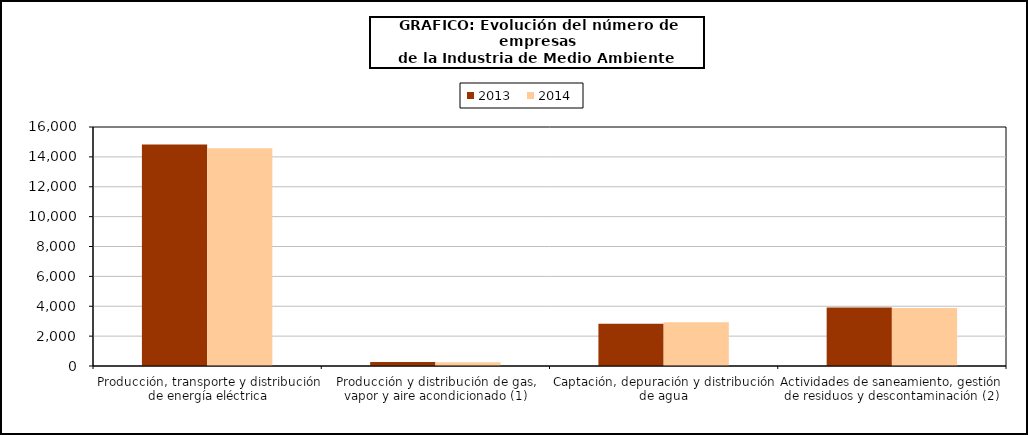
| Category | 2013 | 2014 |
|---|---|---|
| Producción, transporte y distribución de energía eléctrica | 14832 | 14571 |
| Producción y distribución de gas, vapor y aire acondicionado (1) | 262 | 255 |
| Captación, depuración y distribución de agua | 2828 | 2924 |
| Actividades de saneamiento, gestión de residuos y descontaminación (2) | 3917 | 3878 |